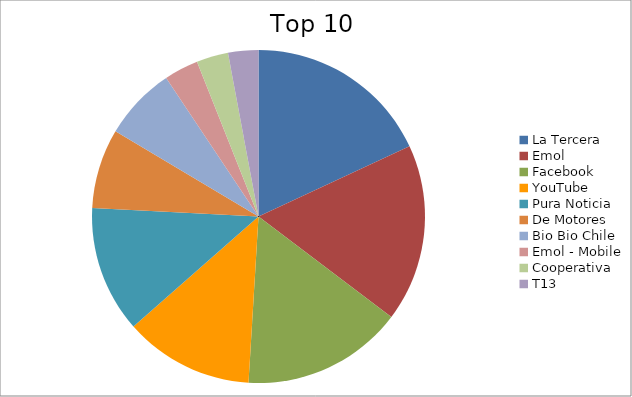
| Category | Series 0 |
|---|---|
| La Tercera | 13.72 |
| Emol | 13.07 |
| Facebook | 11.88 |
| YouTube | 9.54 |
| Pura Noticia | 9.33 |
| De Motores | 5.87 |
| Bio Bio Chile | 5.38 |
| Emol - Mobile | 2.53 |
| Cooperativa | 2.34 |
| T13 | 2.23 |